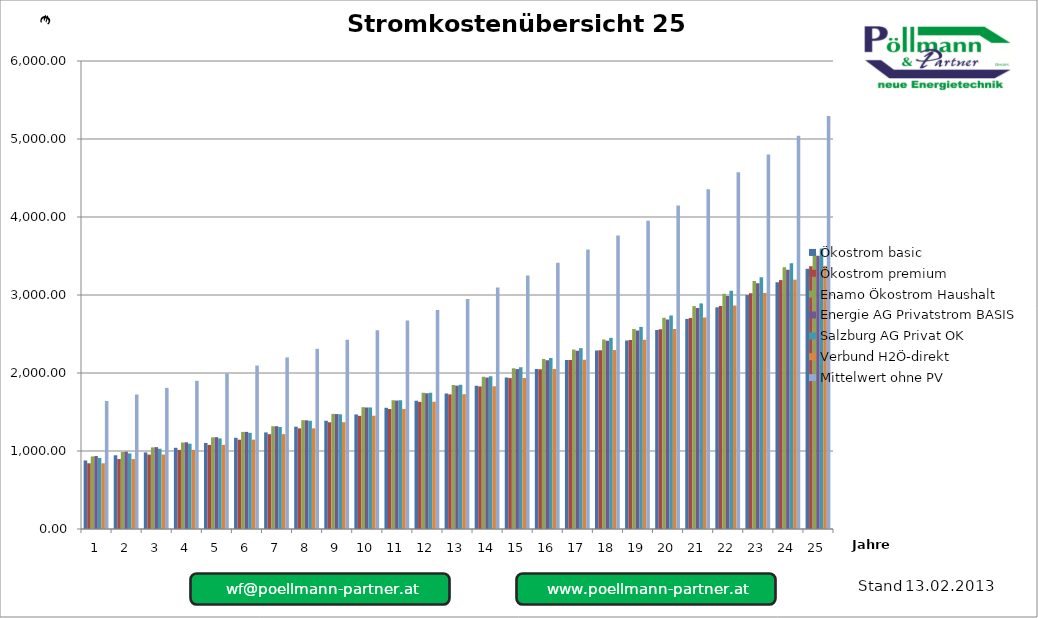
| Category | Ökostrom basic | Ökostrom premium | Enamo Ökostrom Haushalt | Energie AG Privatstrom BASIS | Salzburg AG Privat OK | Verbund H2Ö-direkt | Mittelwert ohne PV |
|---|---|---|---|---|---|---|---|
| 0 | 878.627 | 842.711 | 930.403 | 935.193 | 910.816 | 842.429 | 1641.579 |
| 1 | 945.021 | 896.944 | 986.907 | 990.982 | 968.581 | 896.775 | 1723.658 |
| 2 | 981.832 | 954.131 | 1046.436 | 1049.74 | 1029.48 | 954.083 | 1809.841 |
| 3 | 1041.059 | 1014.424 | 1109.145 | 1111.621 | 1093.673 | 1014.507 | 1900.333 |
| 4 | 1103.45 | 1077.983 | 1175.197 | 1176.783 | 1161.33 | 1078.205 | 1995.35 |
| 5 | 1169.167 | 1144.978 | 1244.764 | 1245.395 | 1232.63 | 1145.349 | 2095.117 |
| 6 | 1238.381 | 1215.583 | 1318.025 | 1317.634 | 1307.759 | 1216.113 | 2199.873 |
| 7 | 1311.271 | 1289.987 | 1395.17 | 1393.683 | 1386.914 | 1290.687 | 2309.867 |
| 8 | 1388.025 | 1368.383 | 1476.396 | 1473.739 | 1470.302 | 1369.264 | 2425.36 |
| 9 | 1468.841 | 1450.976 | 1561.914 | 1558.004 | 1558.141 | 1452.051 | 2546.628 |
| 10 | 1553.925 | 1537.983 | 1651.941 | 1646.694 | 1650.659 | 1539.263 | 2673.959 |
| 11 | 1643.497 | 1629.629 | 1746.708 | 1740.035 | 1748.094 | 1631.129 | 2807.657 |
| 12 | 1737.785 | 1726.153 | 1846.457 | 1838.263 | 1850.699 | 1727.886 | 2948.04 |
| 13 | 1837.029 | 1827.803 | 1951.442 | 1941.627 | 1958.738 | 1829.784 | 3095.442 |
| 14 | 1941.482 | 1934.843 | 2061.93 | 2050.388 | 2072.49 | 1937.088 | 3250.214 |
| 15 | 2051.411 | 2047.548 | 2178.2 | 2164.821 | 2192.245 | 2050.073 | 3412.725 |
| 16 | 2167.093 | 2166.207 | 2300.546 | 2285.213 | 2318.311 | 2169.03 | 3583.361 |
| 17 | 2288.821 | 2291.125 | 2429.279 | 2411.868 | 2451.009 | 2294.264 | 3762.529 |
| 18 | 2416.903 | 2422.622 | 2564.723 | 2545.104 | 2590.677 | 2426.096 | 3950.656 |
| 19 | 2551.662 | 2561.031 | 2707.219 | 2685.255 | 2737.671 | 2564.861 | 4148.189 |
| 20 | 2693.437 | 2706.707 | 2857.124 | 2832.671 | 2892.365 | 2710.914 | 4355.598 |
| 21 | 2842.585 | 2860.019 | 3014.816 | 2987.72 | 3055.149 | 2864.625 | 4573.378 |
| 22 | 2999.479 | 3021.356 | 3180.689 | 3150.791 | 3226.435 | 3026.386 | 4802.047 |
| 23 | 3164.514 | 3191.127 | 3355.158 | 3322.289 | 3406.657 | 3196.605 | 5042.149 |
| 24 | 3338.102 | 3369.76 | 3538.66 | 3502.641 | 3596.268 | 3375.713 | 5294.257 |